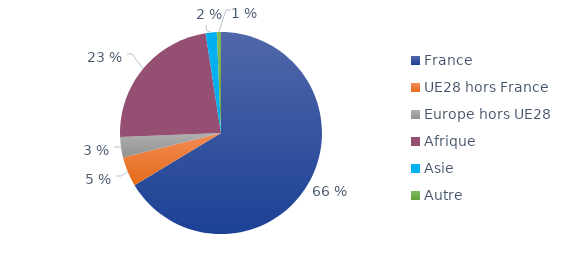
| Category | Series 0 |
|---|---|
| France | 0.664 |
| UE28 hors France | 0.047 |
| Europe hors UE28 | 0.033 |
| Afrique | 0.232 |
| Asie | 0.018 |
| Autre | 0.007 |